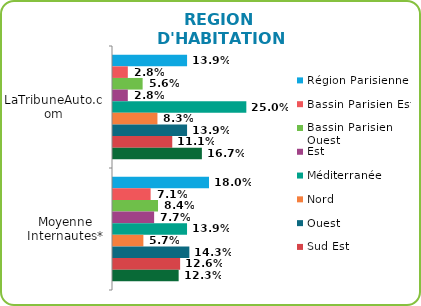
| Category | Région Parisienne | Bassin Parisien Est | Bassin Parisien Ouest | Est | Méditerranée | Nord | Ouest | Sud Est | Sud Ouest |
|---|---|---|---|---|---|---|---|---|---|
| LaTribuneAuto.com | 0.139 | 0.028 | 0.056 | 0.028 | 0.25 | 0.083 | 0.139 | 0.111 | 0.167 |
| Moyenne Internautes* | 0.18 | 0.071 | 0.084 | 0.077 | 0.139 | 0.057 | 0.143 | 0.126 | 0.123 |